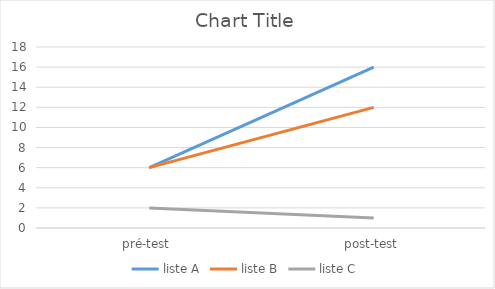
| Category | liste A | liste B | liste C |
|---|---|---|---|
| pré-test | 6 | 6 | 2 |
| post-test | 16 | 12 | 1 |